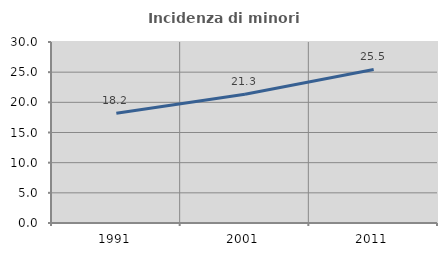
| Category | Incidenza di minori stranieri |
|---|---|
| 1991.0 | 18.182 |
| 2001.0 | 21.337 |
| 2011.0 | 25.455 |